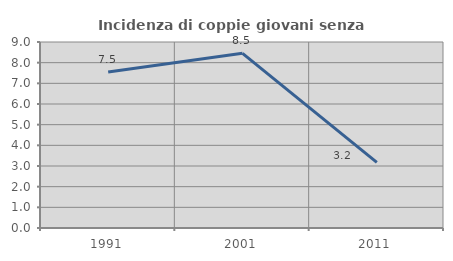
| Category | Incidenza di coppie giovani senza figli |
|---|---|
| 1991.0 | 7.547 |
| 2001.0 | 8.451 |
| 2011.0 | 3.175 |